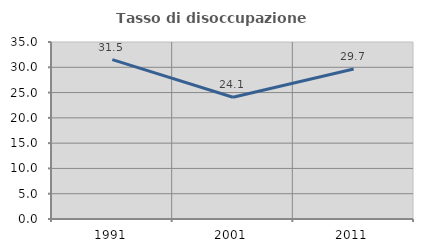
| Category | Tasso di disoccupazione giovanile  |
|---|---|
| 1991.0 | 31.507 |
| 2001.0 | 24.074 |
| 2011.0 | 29.67 |